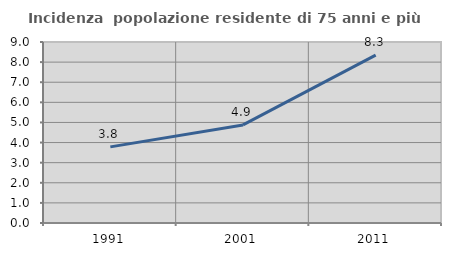
| Category | Incidenza  popolazione residente di 75 anni e più |
|---|---|
| 1991.0 | 3.786 |
| 2001.0 | 4.876 |
| 2011.0 | 8.348 |